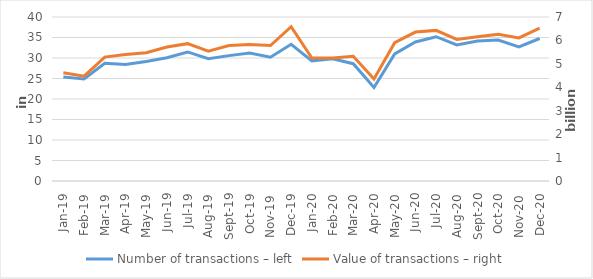
| Category | Number of transactions – left |
|---|---|
| sij.19 | 25337861 |
| Feb-19 | 24877501 |
| ožu.19 | 28696517 |
| tra.19 | 28389936 |
| svi.19 | 29168602 |
| lip.19 | 30050923 |
| srp.19 | 31477207 |
| kol.19 | 29816249 |
| ruj.19 | 30580830 |
| lis.19 | 31225999 |
| stu.19 | 30198337 |
| pro.19 | 33337111 |
| sij.20 | 29304697 |
| Feb-20 | 29831606 |
| ožu.20 | 28609157 |
| tra.20 | 22811373 |
| svi.20 | 31008472 |
| lip.20 | 33899579 |
| srp.20 | 35194797 |
| kol.20 | 33170654 |
| ruj.20 | 34132416 |
| lis.20 | 34392176 |
| stu.20 | 32703782 |
| pro.20 | 34752449 |